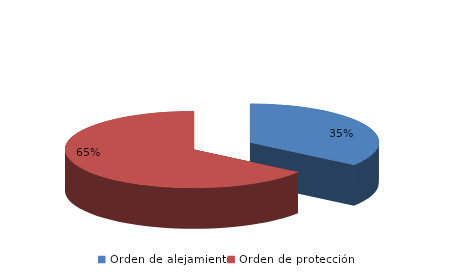
| Category | Series 0 |
|---|---|
| Orden de alejamiento | 192 |
| Orden de protección | 356 |